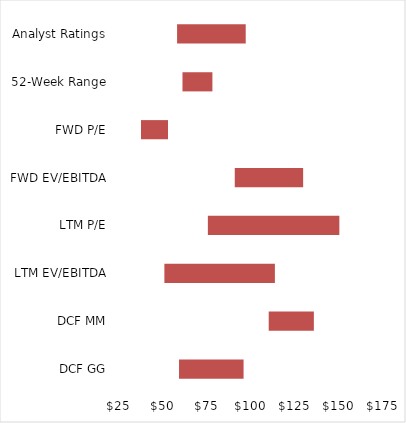
| Category | Q1 | Spread | Q3 |
|---|---|---|---|
| DCF GG | 59.107 | 36.669 | 95.777 |
| DCF MM | 110.069 | 25.652 | 135.721 |
| LTM EV/EBITDA | 50.786 | 62.789 | 113.574 |
| LTM P/E | 75.489 | 74.711 | 150.199 |
| FWD EV/EBITDA | 90.773 | 38.851 | 129.624 |
| FWD P/E | 37.495 | 15.358 | 52.853 |
| 52-Week Range | 61.07 | 17 | 78.07 |
| Analyst Ratings | 58 | 39 | 97 |